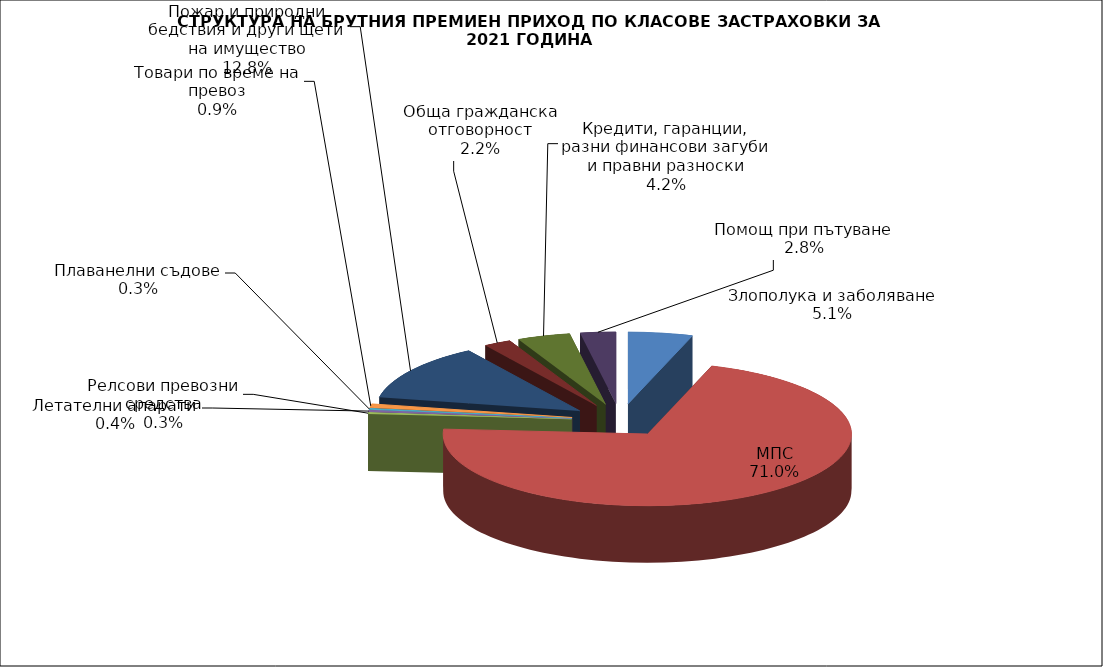
| Category | Злополука и заболяване |
|---|---|
| Злополука и заболяване | 0.051 |
| МПС | 0.71 |
| Релсови превозни средства | 0.003 |
| Летателни апарати | 0.004 |
| Плаванелни съдове | 0.003 |
| Товари по време на превоз | 0.009 |
| Пожар и природни бедствия и други щети на имущество | 0.128 |
| Обща гражданска отговорност | 0.022 |
| Кредити, гаранции, разни финансови загуби и правни разноски | 0.042 |
| Помощ при пътуване | 0.028 |